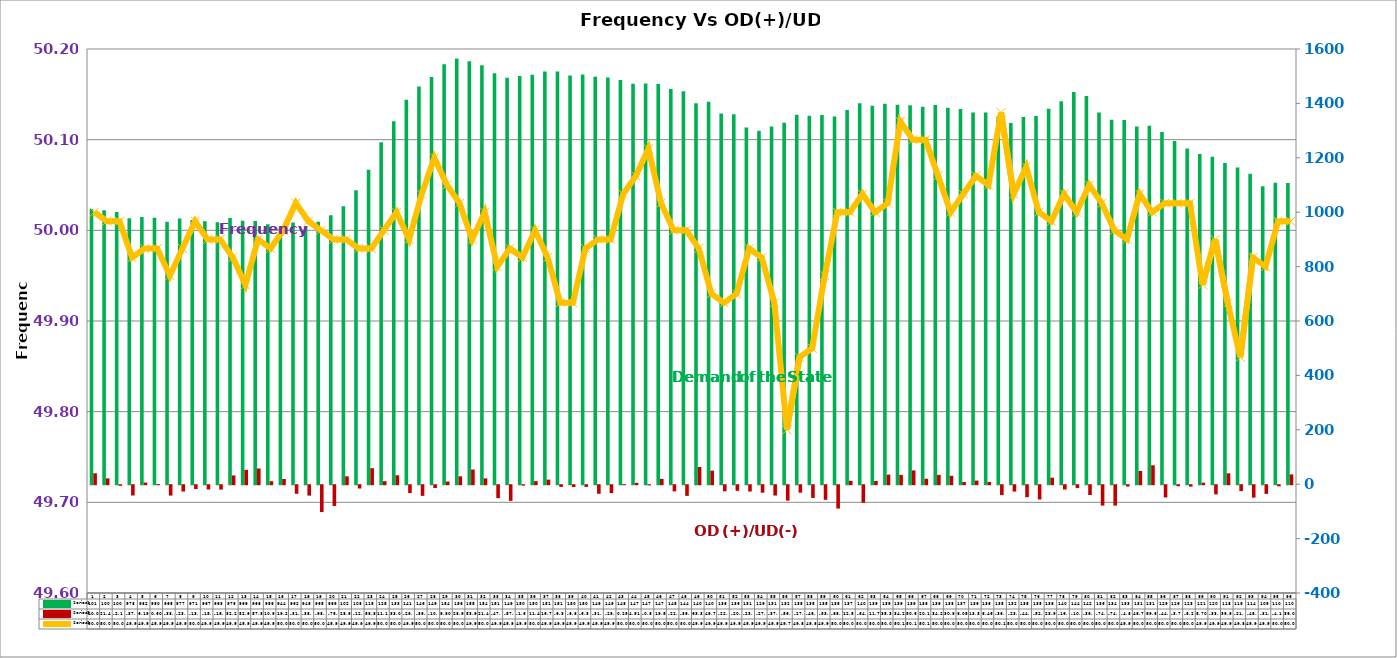
| Category | Series 2 | Series 4 |
|---|---|---|
| 0 | 1012 | 40.073 |
| 1 | 1007 | 21.412 |
| 2 | 1001 | -2.098 |
| 3 | 978 | -37.798 |
| 4 | 982 | 6.191 |
| 5 | 980 | 0.601 |
| 6 | 965 | -38.259 |
| 7 | 977 | -23.259 |
| 8 | 971 | -13.87 |
| 9 | 967 | -15.87 |
| 10 | 963 | -16.01 |
| 11 | 979 | 32.231 |
| 12 | 969 | 52.922 |
| 13 | 968 | 57.873 |
| 14 | 956 | 10.994 |
| 15 | 944 | 19.231 |
| 16 | 962 | -31.474 |
| 17 | 948 | -38.314 |
| 18 | 965 | -98.752 |
| 19 | 989 | -76.272 |
| 20 | 1022 | 28.982 |
| 21 | 1081 | -12.207 |
| 22 | 1156 | 58.844 |
| 23 | 1257 | 11.164 |
| 24 | 1334 | 33.01 |
| 25 | 1413 | -29.033 |
| 26 | 1462 | -39.222 |
| 27 | 1497 | -10.332 |
| 28 | 1544 | 9.801 |
| 29 | 1565 | 28.981 |
| 30 | 1555 | 53.975 |
| 31 | 1540 | 21.435 |
| 32 | 1511 | -47.705 |
| 33 | 1494 | -57.676 |
| 34 | 1501 | -1.598 |
| 35 | 1505 | 11.432 |
| 36 | 1517 | 16.784 |
| 37 | 1517 | -6.356 |
| 38 | 1503 | -6.853 |
| 39 | 1506 | -6.346 |
| 40 | 1498 | -31.491 |
| 41 | 1495 | -29.239 |
| 42 | 1486 | 0.291 |
| 43 | 1472 | 4.912 |
| 44 | 1473 | -0.843 |
| 45 | 1471 | 19.568 |
| 46 | 1453 | -22.678 |
| 47 | 1445 | -39.187 |
| 48 | 1401 | 63.39 |
| 49 | 1406 | 49.74 |
| 50 | 1363 | -22.419 |
| 51 | 1360 | -20.688 |
| 52 | 1311 | -23.407 |
| 53 | 1299 | -27.507 |
| 54 | 1315 | -37.952 |
| 55 | 1329 | -56.772 |
| 56 | 1358 | -27.558 |
| 57 | 1355 | -46.848 |
| 58 | 1357 | -53.711 |
| 59 | 1352 | -85.892 |
| 60 | 1376 | 12.588 |
| 61 | 1401 | -64.487 |
| 62 | 1391 | 11.753 |
| 63 | 1399 | 35.353 |
| 64 | 1395 | 34.213 |
| 65 | 1393 | 50.683 |
| 66 | 1388 | 20.096 |
| 67 | 1394 | 34.216 |
| 68 | 1384 | 30.986 |
| 69 | 1379 | 8.055 |
| 70 | 1367 | 13.315 |
| 71 | 1367 | 8.458 |
| 72 | 1351 | -36.355 |
| 73 | 1328 | -23.435 |
| 74 | 1350 | -44.096 |
| 75 | 1354 | -52.41 |
| 76 | 1380 | 23.993 |
| 77 | 1408 | -16.007 |
| 78 | 1442 | -10.699 |
| 79 | 1427 | -36.099 |
| 80 | 1367 | -74.929 |
| 81 | 1340 | -74.939 |
| 82 | 1339 | -4.805 |
| 83 | 1315 | 48.749 |
| 84 | 1318 | 69.612 |
| 85 | 1295 | -44.956 |
| 86 | 1262 | -3.732 |
| 87 | 1234 | -5.251 |
| 88 | 1214 | 5.7 |
| 89 | 1204 | -33.741 |
| 90 | 1181 | 39.968 |
| 91 | 1164 | -21.608 |
| 92 | 1141 | -45.638 |
| 93 | 1095 | -31.887 |
| 94 | 1108 | -4.186 |
| 95 | 1107 | 36.055 |